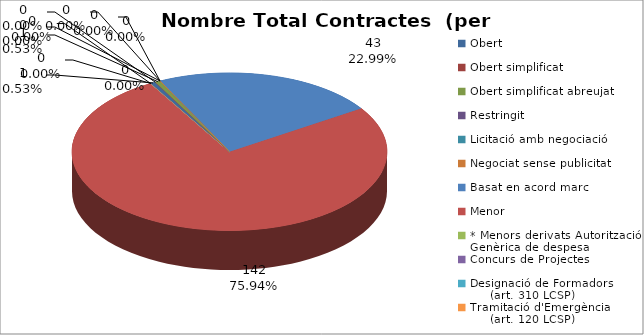
| Category | Nombre Total Contractes |
|---|---|
| Obert | 1 |
| Obert simplificat | 0 |
| Obert simplificat abreujat | 1 |
| Restringit | 0 |
| Licitació amb negociació | 0 |
| Negociat sense publicitat | 0 |
| Basat en acord marc | 43 |
| Menor | 142 |
| * Menors derivats Autorització Genèrica de despesa | 0 |
| Concurs de Projectes | 0 |
| Designació de Formadors
     (art. 310 LCSP) | 0 |
| Tramitació d'Emergència
     (art. 120 LCSP) | 0 |